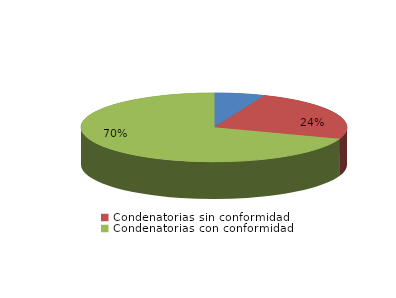
| Category | Series 0 |
|---|---|
| Absolutorias | 14 |
| Condenatorias sin conformidad | 55 |
| Condenatorias con conformidad | 158 |